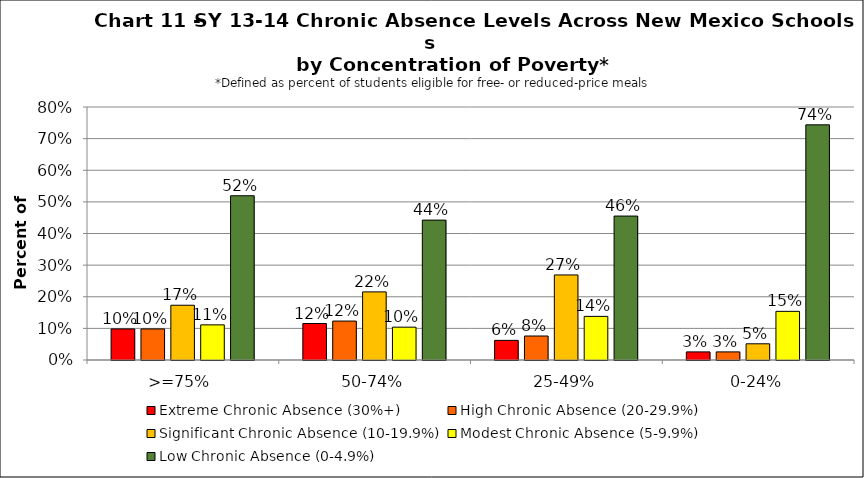
| Category | Extreme Chronic Absence (30%+) | High Chronic Absence (20-29.9%) | Significant Chronic Absence (10-19.9%) | Modest Chronic Absence (5-9.9%) | Low Chronic Absence (0-4.9%) |
|---|---|---|---|---|---|
| 0 | 0.098 | 0.098 | 0.173 | 0.111 | 0.519 |
| 1 | 0.115 | 0.123 | 0.215 | 0.104 | 0.442 |
| 2 | 0.062 | 0.076 | 0.269 | 0.138 | 0.455 |
| 3 | 0.026 | 0.026 | 0.051 | 0.154 | 0.744 |